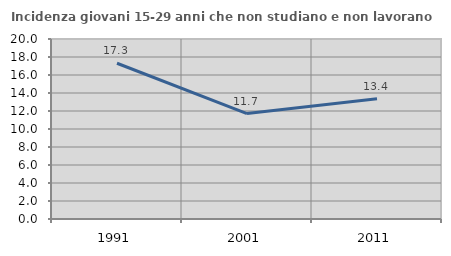
| Category | Incidenza giovani 15-29 anni che non studiano e non lavorano  |
|---|---|
| 1991.0 | 17.308 |
| 2001.0 | 11.711 |
| 2011.0 | 13.37 |